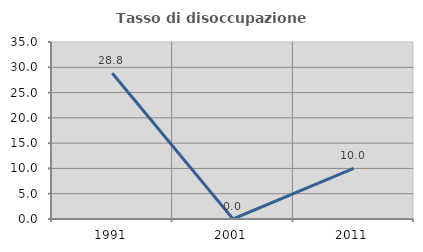
| Category | Tasso di disoccupazione giovanile  |
|---|---|
| 1991.0 | 28.814 |
| 2001.0 | 0 |
| 2011.0 | 10 |